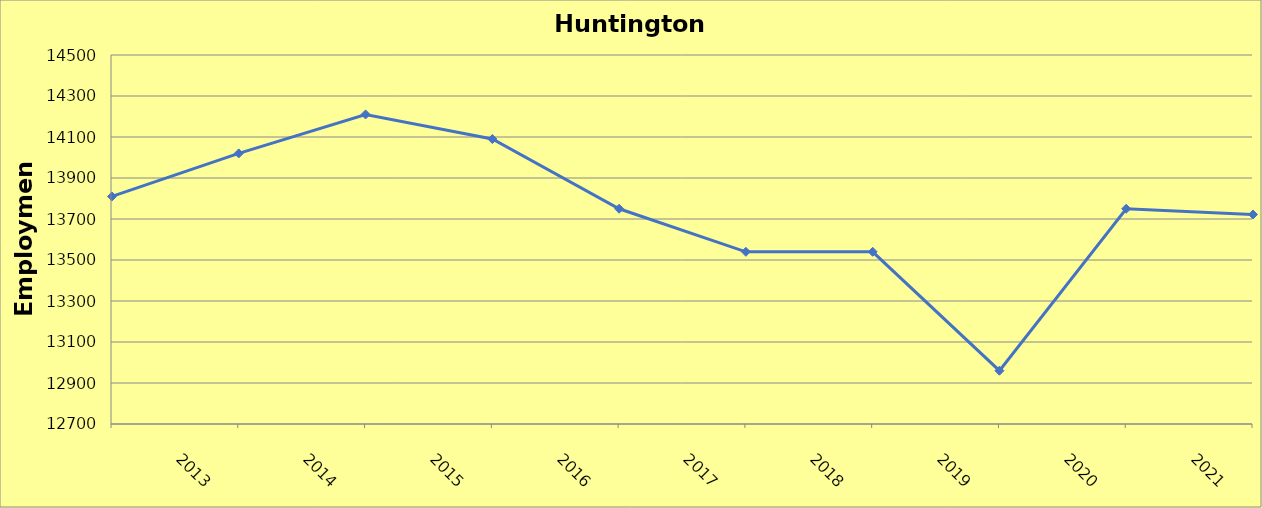
| Category | Huntington County |
|---|---|
| 2013.0 | 13810 |
| 2014.0 | 14020 |
| 2015.0 | 14210 |
| 2016.0 | 14090 |
| 2017.0 | 13750 |
| 2018.0 | 13540 |
| 2019.0 | 13540 |
| 2020.0 | 12960 |
| 2021.0 | 13750 |
| 2022.0 | 13722 |